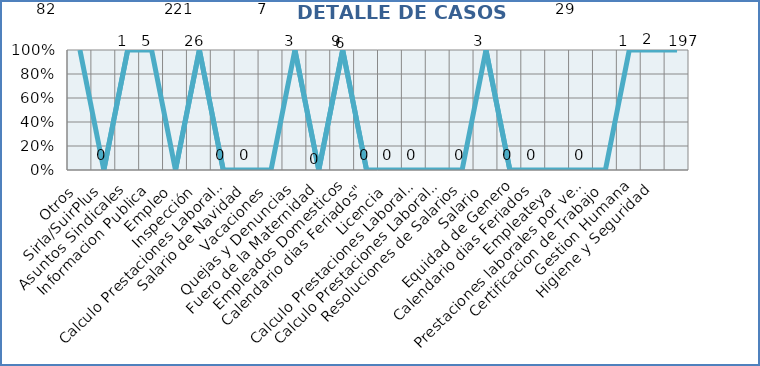
| Category | Series 0 |
|---|---|
| Otros | 2 |
| Sirla/SuirPlus | 0 |
| Asuntos Sindicales | 1 |
| Informacion Publica | 5 |
| Empleo | 0 |
| Inspección | 73 |
| Calculo Prestaciones Laborales | 0 |
| Salario de Navidad | 0 |
| Vacaciones | 0 |
| Quejas y Denuncias | 3 |
| Fuero de la Maternidad | 0 |
| Empleados Domesticos | 2 |
| Calendario dias Feriados" | 0 |
| Licencia | 0 |
| Calculo Prestaciones Laborales por quiebra empresa | 0 |
| Calculo Prestaciones Laborales por renuncia | 0 |
| Resoluciones de Salarios | 0 |
| Salario | 1 |
| Equidad de Genero | 0 |
| Calendario dias Feriados | 0 |
| Empleateya | 0 |
| Prestaciones laborales por venta empresa | 0 |
| Certificacion de Trabajo | 0 |
| Gestion Humana | 1 |
| Higiene y Seguridad | 2 |